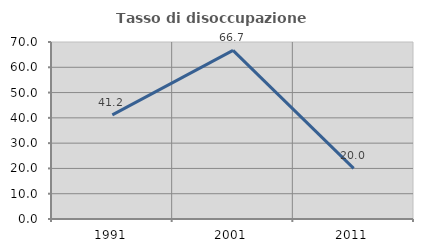
| Category | Tasso di disoccupazione giovanile  |
|---|---|
| 1991.0 | 41.176 |
| 2001.0 | 66.667 |
| 2011.0 | 20 |